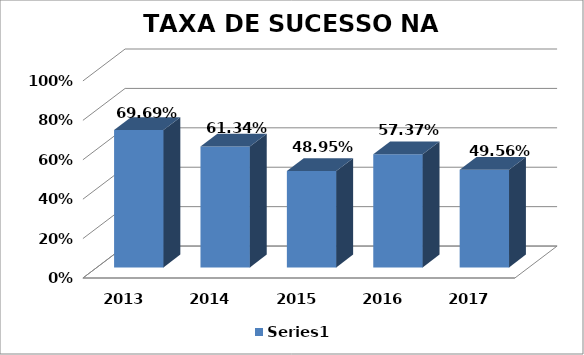
| Category | Series 0 |
|---|---|
| 2013.0 | 0.697 |
| 2014.0 | 0.613 |
| 2015.0 | 0.489 |
| 2016.0 | 0.574 |
| 2017.0 | 0.496 |